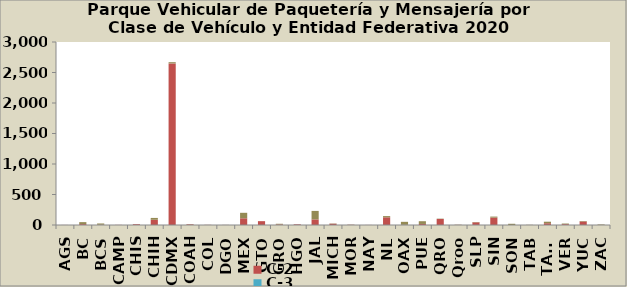
| Category | C-2 | C-3 | Camioneta |
|---|---|---|---|
| AGS | 1 | 0 | 0 |
| BC | 15 | 0 | 32 |
| BCS | 4 | 0 | 21 |
| CAMP | 2 | 0 | 0 |
| CHIS | 13 | 0 | 0 |
| CHIH | 86 | 0 | 30 |
| CDMX | 2649 | 0 | 20 |
| COAH | 11 | 0 | 2 |
| COL | 2 | 0 | 1 |
| DGO | 1 | 0 | 1 |
| MEX | 110 | 0 | 90 |
| GTO | 63 | 0 | 0 |
| GRO | 10 | 0 | 10 |
| HGO | 11 | 1 | 0 |
| JAL | 92 | 0 | 139 |
| MICH | 21 | 0 | 4 |
| MOR | 4 | 0 | 2 |
| NAY | 1 | 0 | 0 |
| NL | 126 | 0 | 20 |
| OAX | 3 | 0 | 49 |
| PUE | 17 | 0 | 45 |
| QRO | 99 | 0 | 5 |
| Qroo | 2 | 0 | 3 |
| SLP | 44 | 0 | 5 |
| SIN | 121 | 0 | 17 |
| SON | 0 | 0 | 20 |
| TAB | 1 | 0 | 2 |
| TAMS | 29 | 0 | 25 |
| VER | 14 | 0 | 10 |
| YUC | 58 | 0 | 8 |
| ZAC | 1 | 0 | 8 |